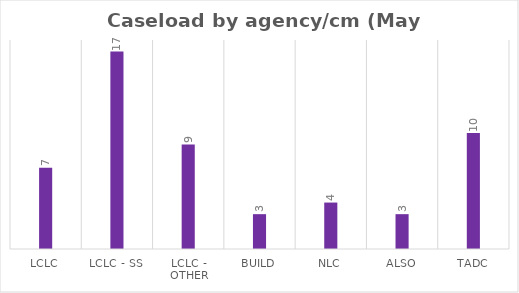
| Category | Series 0 |
|---|---|
| LCLC | 7 |
| LCLC - SS | 17 |
| LCLC - Other | 9 |
| BUILD | 3 |
| NLC | 4 |
| ALSO | 3 |
| TADC | 10 |